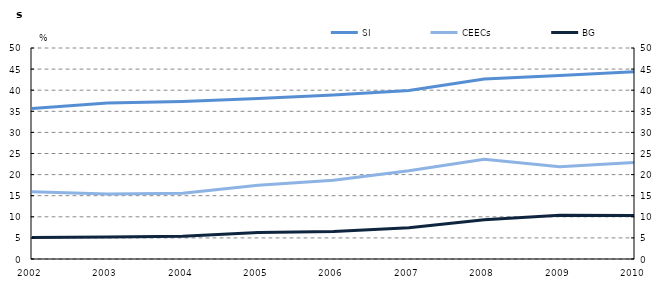
| Category | SI | CEECs |
|---|---|---|
| 2002.0 | 35.656 | 15.925 |
| 2003.0 | 36.971 | 15.408 |
| 2004.0 | 37.32 | 15.598 |
| 2005.0 | 38.034 | 17.484 |
| 2006.0 | 38.849 | 18.687 |
| 2007.0 | 39.92 | 20.893 |
| 2008.0 | 42.639 | 23.633 |
| 2009.0 | 43.461 | 21.875 |
| 2010.0 | 44.382 | 22.861 |